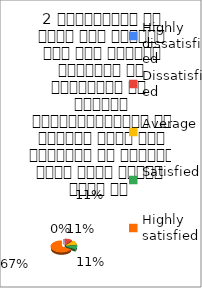
| Category | 2 व्याख्यान से रूचि में वृद्धि हुई एवं शिक्षण जानकारी से परिपूर्ण था 
शिक्षक विद्यार्थियों के द्वारा पूछे गये प्रश्नो का समाधान करने हेतु तत्पर  रहते है  |
|---|---|
| Highly dissatisfied | 0 |
| Dissatisfied | 1 |
| Average | 1 |
| Satisfied | 1 |
| Highly satisfied | 6 |